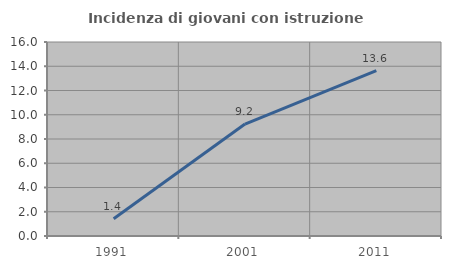
| Category | Incidenza di giovani con istruzione universitaria |
|---|---|
| 1991.0 | 1.429 |
| 2001.0 | 9.231 |
| 2011.0 | 13.636 |